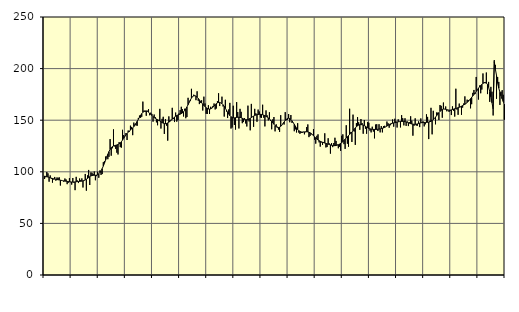
| Category | Piggar | Series 1 |
|---|---|---|
| nan | 93 | 95.84 |
| 87.0 | 94.7 | 95.52 |
| 87.0 | 99.8 | 95.21 |
| 87.0 | 98.5 | 94.94 |
| 87.0 | 90.4 | 94.55 |
| 87.0 | 96.5 | 94.19 |
| 87.0 | 93.2 | 93.85 |
| 87.0 | 89.5 | 93.54 |
| 87.0 | 92.6 | 93.22 |
| 87.0 | 95 | 92.93 |
| 87.0 | 91.4 | 92.69 |
| 87.0 | 94.5 | 92.48 |
| nan | 94.2 | 92.29 |
| 88.0 | 94.6 | 92.12 |
| 88.0 | 86.7 | 91.9 |
| 88.0 | 91.3 | 91.64 |
| 88.0 | 91.4 | 91.41 |
| 88.0 | 90.4 | 91.22 |
| 88.0 | 93.5 | 91.04 |
| 88.0 | 92.6 | 90.88 |
| 88.0 | 88 | 90.74 |
| 88.0 | 89.4 | 90.58 |
| 88.0 | 93.8 | 90.39 |
| 88.0 | 90 | 90.23 |
| nan | 87.6 | 90.12 |
| 89.0 | 94 | 90.04 |
| 89.0 | 89.4 | 90.08 |
| 89.0 | 82.2 | 90.21 |
| 89.0 | 95.1 | 90.35 |
| 89.0 | 91.6 | 90.5 |
| 89.0 | 89.1 | 90.63 |
| 89.0 | 93.5 | 90.72 |
| 89.0 | 92 | 90.82 |
| 89.0 | 93.6 | 90.96 |
| 89.0 | 84.8 | 91.2 |
| 89.0 | 91.3 | 91.57 |
| nan | 97.9 | 92.1 |
| 90.0 | 81.7 | 92.79 |
| 90.0 | 96.5 | 93.57 |
| 90.0 | 101.8 | 94.42 |
| 90.0 | 87.2 | 95.26 |
| 90.0 | 99.4 | 95.95 |
| 90.0 | 99.1 | 96.4 |
| 90.0 | 97.9 | 96.62 |
| 90.0 | 100.3 | 96.64 |
| 90.0 | 91.8 | 96.63 |
| 90.0 | 95.8 | 96.79 |
| 90.0 | 100 | 97.21 |
| nan | 94.2 | 98.01 |
| 91.0 | 101.3 | 99.29 |
| 91.0 | 97 | 101 |
| 91.0 | 97.8 | 103.08 |
| 91.0 | 109.3 | 105.53 |
| 91.0 | 110.5 | 108.28 |
| 91.0 | 114.8 | 111.21 |
| 91.0 | 114.7 | 114.16 |
| 91.0 | 112.2 | 116.99 |
| 91.0 | 114.5 | 119.56 |
| 91.0 | 131.7 | 121.7 |
| 91.0 | 115.6 | 123.29 |
| nan | 122.8 | 124.36 |
| 92.0 | 141.1 | 125 |
| 92.0 | 124.6 | 125.39 |
| 92.0 | 122.2 | 125.69 |
| 92.0 | 118.5 | 126 |
| 92.0 | 116.8 | 126.41 |
| 92.0 | 128.8 | 127.01 |
| 92.0 | 123.9 | 127.93 |
| 92.0 | 123.4 | 129.19 |
| 92.0 | 140.7 | 130.73 |
| 92.0 | 135.6 | 132.43 |
| 92.0 | 133.8 | 134.16 |
| nan | 137.5 | 135.83 |
| 93.0 | 130.8 | 137.26 |
| 93.0 | 140 | 138.43 |
| 93.0 | 138.7 | 139.48 |
| 93.0 | 144.7 | 140.43 |
| 93.0 | 143.5 | 141.39 |
| 93.0 | 135.5 | 142.48 |
| 93.0 | 147.7 | 143.78 |
| 93.0 | 145.9 | 145.34 |
| 93.0 | 144.9 | 147.09 |
| 93.0 | 144.6 | 148.95 |
| 93.0 | 152.2 | 150.89 |
| nan | 154.5 | 152.83 |
| 94.0 | 152.3 | 154.7 |
| 94.0 | 153.3 | 156.36 |
| 94.0 | 168 | 157.65 |
| 94.0 | 159.3 | 158.53 |
| 94.0 | 158.1 | 158.96 |
| 94.0 | 154.3 | 158.99 |
| 94.0 | 159.2 | 158.57 |
| 94.0 | 160.7 | 157.79 |
| 94.0 | 154.8 | 156.77 |
| 94.0 | 157.3 | 155.63 |
| 94.0 | 156.1 | 154.51 |
| nan | 148.6 | 153.47 |
| 95.0 | 155.5 | 152.54 |
| 95.0 | 153 | 151.8 |
| 95.0 | 147.9 | 151.16 |
| 95.0 | 145.1 | 150.53 |
| 95.0 | 149.4 | 149.9 |
| 95.0 | 161 | 149.21 |
| 95.0 | 141.9 | 148.47 |
| 95.0 | 151.3 | 147.75 |
| 95.0 | 153.3 | 147.12 |
| 95.0 | 136.7 | 146.72 |
| 95.0 | 151 | 146.62 |
| nan | 144.7 | 146.85 |
| 96.0 | 130.2 | 147.37 |
| 96.0 | 153.7 | 148.09 |
| 96.0 | 150 | 148.96 |
| 96.0 | 150.5 | 149.96 |
| 96.0 | 162 | 151 |
| 96.0 | 151.2 | 152.02 |
| 96.0 | 148.2 | 152.99 |
| 96.0 | 157.4 | 153.86 |
| 96.0 | 148.6 | 154.53 |
| 96.0 | 150 | 155.06 |
| 96.0 | 156.5 | 155.47 |
| nan | 159.8 | 155.85 |
| 97.0 | 163 | 156.35 |
| 97.0 | 160.7 | 157.09 |
| 97.0 | 153.6 | 158.09 |
| 97.0 | 161.1 | 159.38 |
| 97.0 | 151.9 | 160.96 |
| 97.0 | 153.1 | 162.84 |
| 97.0 | 171.7 | 165 |
| 97.0 | 167.7 | 167.28 |
| 97.0 | 168.5 | 169.49 |
| 97.0 | 180.4 | 171.42 |
| 97.0 | 172.5 | 172.82 |
| nan | 174.7 | 173.58 |
| 98.0 | 174.1 | 173.7 |
| 98.0 | 169.4 | 173.23 |
| 98.0 | 178 | 172.31 |
| 98.0 | 168.8 | 171.1 |
| 98.0 | 165.6 | 169.74 |
| 98.0 | 166.9 | 168.33 |
| 98.0 | 169.3 | 166.91 |
| 98.0 | 159.4 | 165.51 |
| 98.0 | 172.8 | 164.24 |
| 98.0 | 166.2 | 163.12 |
| 98.0 | 156.2 | 162.12 |
| nan | 156 | 161.36 |
| 99.0 | 164.5 | 160.89 |
| 99.0 | 156 | 160.76 |
| 99.0 | 163 | 160.98 |
| 99.0 | 162 | 161.61 |
| 99.0 | 163.8 | 162.57 |
| 99.0 | 166.2 | 163.74 |
| 99.0 | 160.4 | 164.97 |
| 99.0 | 161.3 | 166.06 |
| 99.0 | 168.5 | 166.8 |
| 99.0 | 176.1 | 167.15 |
| 99.0 | 163.7 | 167.17 |
| nan | 166.8 | 166.8 |
| 0.0 | 172.8 | 166.04 |
| 0.0 | 163.3 | 164.93 |
| 0.0 | 153.5 | 163.45 |
| 0.0 | 169.8 | 161.64 |
| 0.0 | 158.4 | 159.69 |
| 0.0 | 152.1 | 157.74 |
| 0.0 | 160.4 | 155.93 |
| 0.0 | 166.8 | 154.43 |
| 0.0 | 141.9 | 153.33 |
| 0.0 | 142.9 | 152.61 |
| 0.0 | 164 | 152.26 |
| nan | 145.4 | 152.27 |
| 1.0 | 140.9 | 152.43 |
| 1.0 | 167.5 | 152.63 |
| 1.0 | 157.9 | 152.84 |
| 1.0 | 142 | 152.91 |
| 1.0 | 161 | 152.72 |
| 1.0 | 158.1 | 152.38 |
| 1.0 | 147.1 | 151.88 |
| 1.0 | 148.2 | 151.29 |
| 1.0 | 152 | 150.78 |
| 1.0 | 146.8 | 150.51 |
| 1.0 | 143.9 | 150.47 |
| nan | 164.1 | 150.68 |
| 2.0 | 148.8 | 151.19 |
| 2.0 | 140.2 | 151.83 |
| 2.0 | 165.8 | 152.49 |
| 2.0 | 153.5 | 153.23 |
| 2.0 | 143.6 | 153.95 |
| 2.0 | 161 | 154.54 |
| 2.0 | 156.7 | 155 |
| 2.0 | 148.5 | 155.34 |
| 2.0 | 160.3 | 155.55 |
| 2.0 | 158.5 | 155.68 |
| 2.0 | 152.6 | 155.7 |
| nan | 152.3 | 155.57 |
| 3.0 | 165 | 155.27 |
| 3.0 | 152.4 | 154.89 |
| 3.0 | 144 | 154.39 |
| 3.0 | 159.5 | 153.74 |
| 3.0 | 154.7 | 153.02 |
| 3.0 | 149.8 | 152.23 |
| 3.0 | 157.7 | 151.26 |
| 3.0 | 149.4 | 150.16 |
| 3.0 | 141.2 | 148.93 |
| 3.0 | 150.8 | 147.54 |
| 3.0 | 153.1 | 146.13 |
| nan | 139.2 | 144.83 |
| 4.0 | 146 | 143.76 |
| 4.0 | 143.7 | 143.07 |
| 4.0 | 140.9 | 142.89 |
| 4.0 | 138.7 | 143.24 |
| 4.0 | 154.9 | 144.06 |
| 4.0 | 145.1 | 145.25 |
| 4.0 | 146.3 | 146.71 |
| 4.0 | 145.8 | 148.28 |
| 4.0 | 157.8 | 149.77 |
| 4.0 | 150 | 150.98 |
| 4.0 | 150.4 | 151.72 |
| nan | 156 | 151.91 |
| 5.0 | 148 | 151.57 |
| 5.0 | 155 | 150.69 |
| 5.0 | 147.4 | 149.38 |
| 5.0 | 148 | 147.8 |
| 5.0 | 139.3 | 146.04 |
| 5.0 | 141.1 | 144.21 |
| 5.0 | 138.1 | 142.48 |
| 5.0 | 147.1 | 141 |
| 5.0 | 138 | 139.86 |
| 5.0 | 136.8 | 139.07 |
| 5.0 | 137.6 | 138.61 |
| nan | 137.6 | 138.44 |
| 6.0 | 138.8 | 138.5 |
| 6.0 | 136.3 | 138.67 |
| 6.0 | 138.4 | 138.79 |
| 6.0 | 143.4 | 138.81 |
| 6.0 | 145.9 | 138.66 |
| 6.0 | 133.6 | 138.32 |
| 6.0 | 134.8 | 137.79 |
| 6.0 | 136.3 | 137.06 |
| 6.0 | 135.7 | 136.08 |
| 6.0 | 141.4 | 134.97 |
| 6.0 | 131.1 | 133.84 |
| nan | 127.3 | 132.74 |
| 7.0 | 134.9 | 131.72 |
| 7.0 | 136.3 | 130.86 |
| 7.0 | 128.5 | 130.16 |
| 7.0 | 124.4 | 129.58 |
| 7.0 | 128.5 | 129.07 |
| 7.0 | 126 | 128.62 |
| 7.0 | 128.9 | 128.23 |
| 7.0 | 137.3 | 127.85 |
| 7.0 | 123.6 | 127.47 |
| 7.0 | 124 | 127.09 |
| 7.0 | 132.5 | 126.76 |
| nan | 127.5 | 126.46 |
| 8.0 | 117.6 | 126.12 |
| 8.0 | 127.9 | 125.76 |
| 8.0 | 123.9 | 125.5 |
| 8.0 | 127.9 | 125.35 |
| 8.0 | 133 | 125.34 |
| 8.0 | 129.9 | 125.52 |
| 8.0 | 126.4 | 125.82 |
| 8.0 | 122.8 | 126.23 |
| 8.0 | 124.3 | 126.8 |
| 8.0 | 120.3 | 127.5 |
| 8.0 | 134.9 | 128.3 |
| nan | 136.3 | 129.27 |
| 9.0 | 126.8 | 130.42 |
| 9.0 | 122.2 | 131.64 |
| 9.0 | 145.1 | 132.83 |
| 9.0 | 127.2 | 133.98 |
| 9.0 | 124.3 | 135.08 |
| 9.0 | 161.1 | 136.15 |
| 9.0 | 138.4 | 137.28 |
| 9.0 | 128.9 | 138.5 |
| 9.0 | 155.4 | 139.83 |
| 9.0 | 139 | 141.23 |
| 9.0 | 126.1 | 142.56 |
| nan | 147.2 | 143.68 |
| 10.0 | 153 | 144.57 |
| 10.0 | 148 | 145.24 |
| 10.0 | 140.7 | 145.64 |
| 10.0 | 151.1 | 145.72 |
| 10.0 | 147.3 | 145.62 |
| 10.0 | 136.9 | 145.33 |
| 10.0 | 150.2 | 144.79 |
| 10.0 | 141.7 | 144.13 |
| 10.0 | 136.9 | 143.39 |
| 10.0 | 148.3 | 142.64 |
| 10.0 | 147.5 | 142.05 |
| nan | 139.9 | 141.65 |
| 11.0 | 138.2 | 141.36 |
| 11.0 | 143.7 | 141.18 |
| 11.0 | 139 | 141.09 |
| 11.0 | 132.4 | 141.06 |
| 11.0 | 145.8 | 141.04 |
| 11.0 | 146.1 | 141.07 |
| 11.0 | 139.5 | 141.19 |
| 11.0 | 146.1 | 141.36 |
| 11.0 | 138.2 | 141.6 |
| 11.0 | 144.3 | 141.89 |
| 11.0 | 138.2 | 142.19 |
| nan | 144.3 | 142.55 |
| 12.0 | 144.6 | 143.03 |
| 12.0 | 143.6 | 143.62 |
| 12.0 | 148.7 | 144.31 |
| 12.0 | 147.1 | 145.07 |
| 12.0 | 142.7 | 145.8 |
| 12.0 | 145.1 | 146.38 |
| 12.0 | 146.2 | 146.82 |
| 12.0 | 150.7 | 147.13 |
| 12.0 | 143.7 | 147.38 |
| 12.0 | 151.4 | 147.62 |
| 12.0 | 148.8 | 147.88 |
| nan | 142.9 | 148.18 |
| 13.0 | 150.8 | 148.44 |
| 13.0 | 148.7 | 148.61 |
| 13.0 | 143 | 148.72 |
| 13.0 | 154.9 | 148.8 |
| 13.0 | 152 | 148.82 |
| 13.0 | 145 | 148.77 |
| 13.0 | 151.9 | 148.62 |
| 13.0 | 144.5 | 148.35 |
| 13.0 | 148.8 | 147.99 |
| 13.0 | 144.3 | 147.57 |
| 13.0 | 148 | 147.1 |
| nan | 153.8 | 146.66 |
| 14.0 | 149.6 | 146.33 |
| 14.0 | 135 | 146.13 |
| 14.0 | 144.6 | 146.05 |
| 14.0 | 151.8 | 146.04 |
| 14.0 | 144.8 | 146.15 |
| 14.0 | 144.7 | 146.42 |
| 14.0 | 148.9 | 146.73 |
| 14.0 | 143.3 | 147.09 |
| 14.0 | 151.7 | 147.42 |
| 14.0 | 148.3 | 147.65 |
| 14.0 | 148.8 | 147.81 |
| nan | 144 | 147.86 |
| 15.0 | 146 | 147.83 |
| 15.0 | 155.7 | 147.85 |
| 15.0 | 153.2 | 147.96 |
| 15.0 | 131.7 | 148.13 |
| 15.0 | 149.4 | 148.44 |
| 15.0 | 162 | 148.94 |
| 15.0 | 136.3 | 149.65 |
| 15.0 | 159.1 | 150.57 |
| 15.0 | 151.9 | 151.7 |
| 15.0 | 146 | 152.99 |
| 15.0 | 157.5 | 154.41 |
| nan | 157.3 | 155.88 |
| 16.0 | 150.2 | 157.33 |
| 16.0 | 164.7 | 158.6 |
| 16.0 | 163.9 | 159.6 |
| 16.0 | 152.4 | 160.36 |
| 16.0 | 167.1 | 160.78 |
| 16.0 | 160.7 | 160.8 |
| 16.0 | 163.3 | 160.56 |
| 16.0 | 158.6 | 160.23 |
| 16.0 | 160 | 159.89 |
| 16.0 | 158 | 159.71 |
| 16.0 | 159.1 | 159.76 |
| nan | 155 | 160 |
| 17.0 | 163.4 | 160.34 |
| 17.0 | 159.1 | 160.73 |
| 17.0 | 153.5 | 161.09 |
| 17.0 | 180.5 | 161.43 |
| 17.0 | 160.3 | 161.76 |
| 17.0 | 155.2 | 162.1 |
| 17.0 | 166.1 | 162.53 |
| 17.0 | 162.6 | 163.04 |
| 17.0 | 155.2 | 163.58 |
| 17.0 | 162.2 | 164.18 |
| 17.0 | 166.2 | 164.78 |
| nan | 173.1 | 165.42 |
| 18.0 | 166.1 | 166.21 |
| 18.0 | 169.9 | 167.15 |
| 18.0 | 169.5 | 168.28 |
| 18.0 | 169.4 | 169.54 |
| 18.0 | 161.5 | 170.82 |
| 18.0 | 165.5 | 172.15 |
| 18.0 | 176.5 | 173.54 |
| 18.0 | 179.3 | 174.93 |
| 18.0 | 175.3 | 176.39 |
| 18.0 | 191.9 | 177.92 |
| 18.0 | 179 | 179.49 |
| nan | 170 | 181 |
| 19.0 | 183.6 | 182.36 |
| 19.0 | 176.1 | 183.61 |
| 19.0 | 179.7 | 184.72 |
| 19.0 | 195.3 | 185.62 |
| 19.0 | 186.8 | 186.32 |
| 19.0 | 185.8 | 186.59 |
| 19.0 | 196.2 | 186.06 |
| 19.0 | 175.3 | 184.51 |
| 19.0 | 187.1 | 181.77 |
| 19.0 | 167.8 | 177.8 |
| 19.0 | 182.3 | 172.68 |
| nan | 177.6 | 166.87 |
| 20.0 | 154.6 | 160.69 |
| 20.0 | 208.2 | 206.76 |
| 20.0 | 203.5 | 199.23 |
| 20.0 | 170.8 | 193.47 |
| 20.0 | 191.8 | 185.78 |
| 20.0 | 187.1 | 181.09 |
| 20.0 | 164.8 | 177.03 |
| 20.0 | 177.6 | 173.56 |
| 20.0 | 179.1 | 170.61 |
| 20.0 | 174.6 | 167.98 |
| 20.0 | 150.5 | 165.52 |